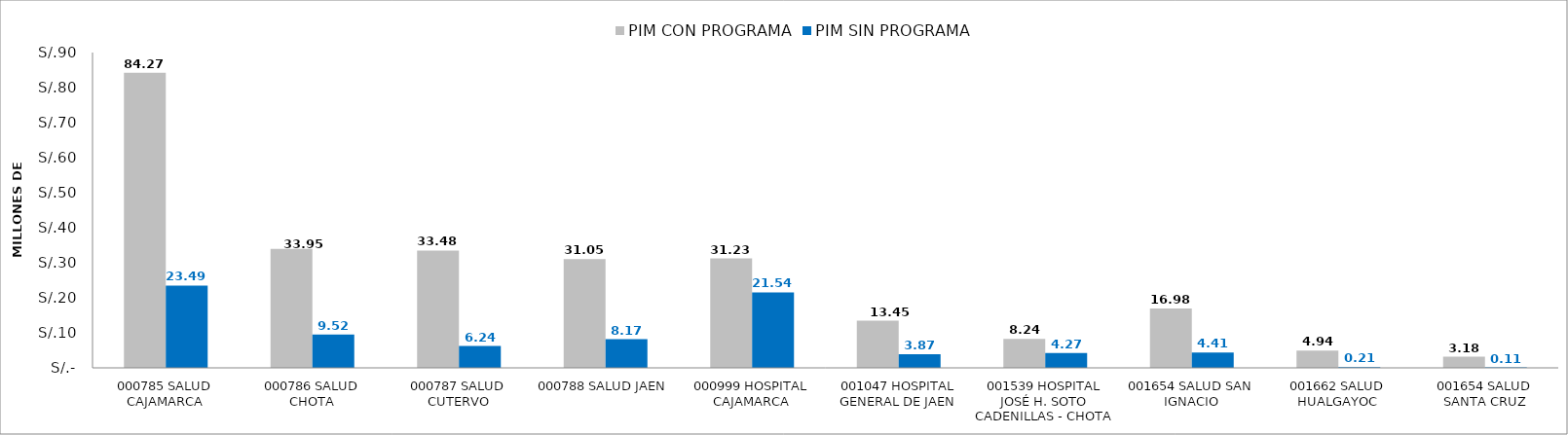
| Category | PIM CON PROGRAMA | PIM SIN PROGRAMA |
|---|---|---|
| 000785 SALUD CAJAMARCA | 84.268 | 23.489 |
| 000786 SALUD CHOTA | 33.947 | 9.523 |
| 000787 SALUD CUTERVO | 33.475 | 6.24 |
| 000788 SALUD JAEN | 31.05 | 8.166 |
| 000999 HOSPITAL CAJAMARCA | 31.229 | 21.542 |
| 001047 HOSPITAL GENERAL DE JAEN | 13.451 | 3.867 |
| 001539 HOSPITAL JOSÉ H. SOTO CADENILLAS - CHOTA | 8.242 | 4.265 |
| 001654 SALUD SAN IGNACIO | 16.978 | 4.405 |
| 001662 SALUD HUALGAYOC | 4.936 | 0.209 |
| 001654 SALUD SANTA CRUZ | 3.184 | 0.109 |